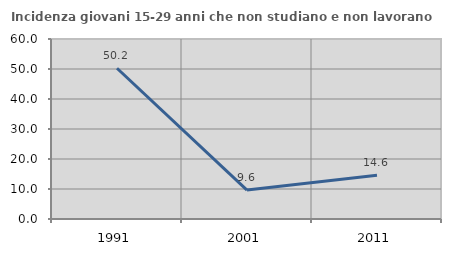
| Category | Incidenza giovani 15-29 anni che non studiano e non lavorano  |
|---|---|
| 1991.0 | 50.24 |
| 2001.0 | 9.64 |
| 2011.0 | 14.571 |